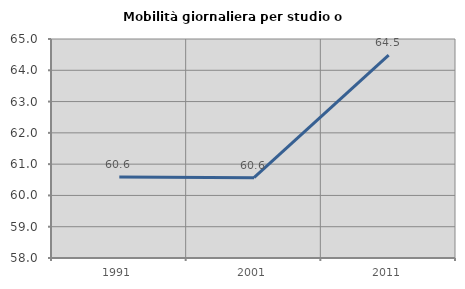
| Category | Mobilità giornaliera per studio o lavoro |
|---|---|
| 1991.0 | 60.59 |
| 2001.0 | 60.567 |
| 2011.0 | 64.481 |